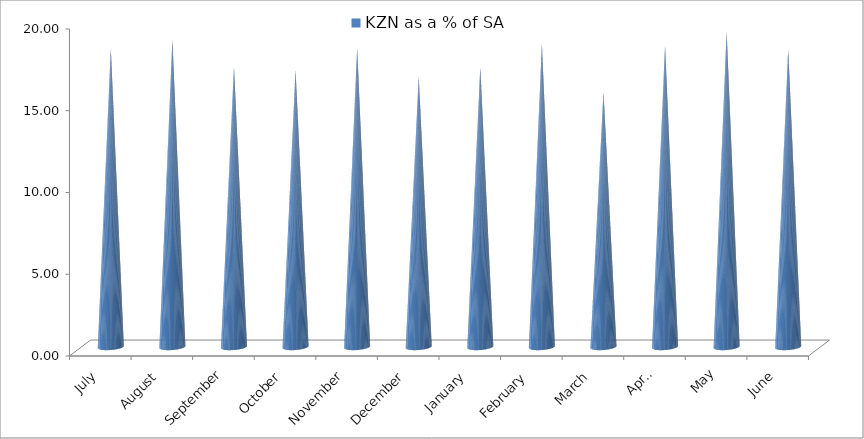
| Category | KZN as a % of SA |
|---|---|
| July | 18.239 |
| August | 18.766 |
| September | 17.123 |
| October | 16.927 |
| November | 18.269 |
| December | 16.526 |
| January | 17.1 |
| February | 18.52 |
| March | 15.598 |
| April | 18.417 |
| May | 19.267 |
| June | 18.209 |